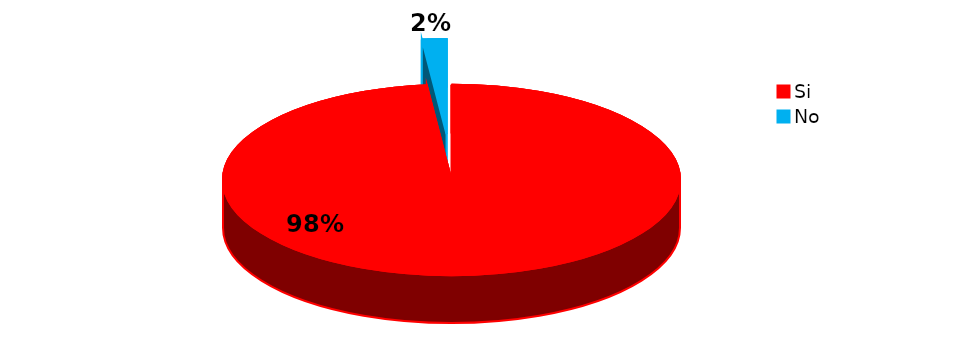
| Category | Series 0 |
|---|---|
| Si | 57 |
| No | 1 |